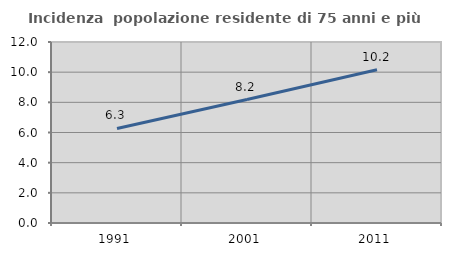
| Category | Incidenza  popolazione residente di 75 anni e più |
|---|---|
| 1991.0 | 6.266 |
| 2001.0 | 8.184 |
| 2011.0 | 10.161 |